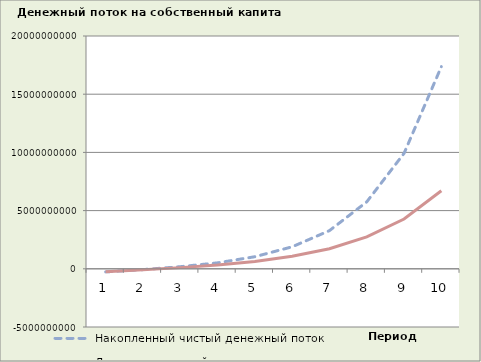
| Category | Накопленный чистый денежный поток | Дисконтированный поток нарастающим итогом |
|---|---|---|
| 1.0 | -265258212.571 | -250087841.166 |
| 2.0 | -69335094.857 | -85893986.201 |
| 3.0 | 181736262.479 | 101137990.711 |
| 4.0 | 511337418.116 | 319388314.745 |
| 5.0 | 1038486045.764 | 629663275.404 |
| 6.0 | 1889528962.394 | 1074922153.709 |
| 7.0 | 3279395678.536 | 1721292998.421 |
| 8.0 | 5750544752.124 | 2742832175.477 |
| 9.0 | 9919805125.558 | 4274845622.208 |
| 10.0 | 17369284731.508 | 6708040941.225 |